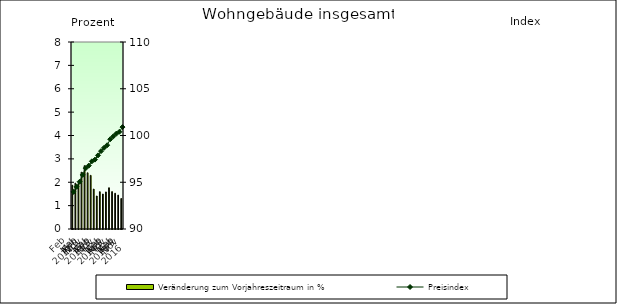
| Category | Veränderung zum Vorjahreszeitraum in % |
|---|---|
| 0 | 1.872 |
| 1 | 1.961 |
| 2 | 1.949 |
| 3 | 2.43 |
| 4 | 2.708 |
| 5 | 2.404 |
| 6 | 2.294 |
| 7 | 1.708 |
| 8 | 1.412 |
| 9 | 1.596 |
| 10 | 1.495 |
| 11 | 1.586 |
| 12 | 1.764 |
| 13 | 1.599 |
| 14 | 1.529 |
| 15 | 1.451 |
| 16 | 1.305 |